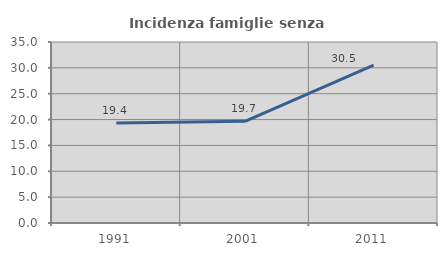
| Category | Incidenza famiglie senza nuclei |
|---|---|
| 1991.0 | 19.36 |
| 2001.0 | 19.657 |
| 2011.0 | 30.532 |